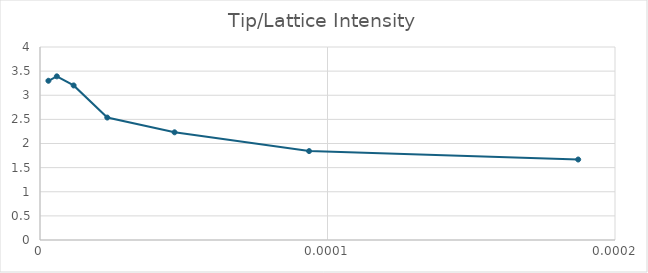
| Category | Tip/Lattice Intensity |
|---|---|
| 2.925e-06 | 3.3 |
| 5.85e-06 | 3.392 |
| 1.17e-05 | 3.203 |
| 2.34e-05 | 2.538 |
| 4.68e-05 | 2.232 |
| 9.36e-05 | 1.843 |
| 0.0001872 | 1.668 |